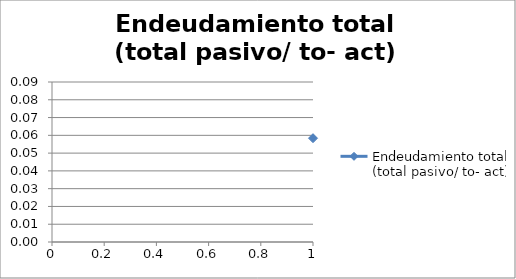
| Category | Endeudamiento total (total pasivo/ to- act) |
|---|---|
| 0 | 0.058 |
| 1 | 0.059 |
| 2 | 0.062 |
| 3 | 0.062 |
| 4 | 0.06 |
| 5 | 0.06 |
| 6 | 0.063 |
| 7 | 0.083 |